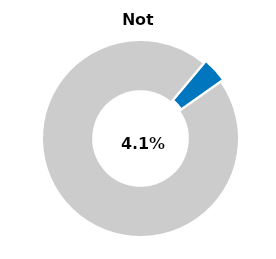
| Category | Series 0 |
|---|---|
| Not passed | 0.041 |
| Other | 0.959 |